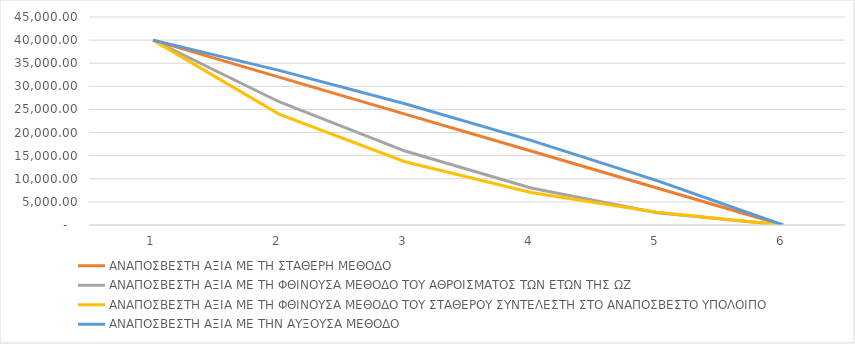
| Category |  ΑΝΑΠΟΣΒΕΣΤΗ ΑΞΙΑ ΜΕ ΤΗ ΣΤΑΘΕΡΗ ΜΕΘΟΔΟ  |  ΑΝΑΠΟΣΒΕΣΤΗ ΑΞΙΑ ΜΕ ΤΗ ΦΘΙΝΟΥΣΑ ΜΕΘΟΔΟ ΤΟΥ ΑΘΡΟΙΣΜΑΤΟΣ ΤΩΝ ΕΤΩΝ ΤΗΣ ΩΖ  |  ΑΝΑΠΟΣΒΕΣΤΗ ΑΞΙΑ ΜΕ ΤΗ ΦΘΙΝΟΥΣΑ ΜΕΘΟΔΟ ΤΟΥ ΣΤΑΘΕΡΟΥ ΣΥΝΤΕΛΕΣΤΗ ΣΤΟ ΑΝΑΠΟΣΒΕΣΤΟ ΥΠΟΛΟΙΠΟ  |  ΑΝΑΠΟΣΒΕΣΤΗ ΑΞΙΑ ΜΕ ΤΗΝ ΑΥΞΟΥΣΑ ΜΕΘΟΔΟ  |
|---|---|---|---|---|
| 0 | 40000 | 40000 | 40000 | 40000 |
| 1 | 32000 | 26666.667 | 23997.731 | 33448.101 |
| 2 | 24000 | 16000 | 13685.964 | 26241.012 |
| 3 | 16000 | 8000 | 7041.123 | 18313.214 |
| 4 | 8000 | 2666.667 | 2759.228 | 9592.636 |
| 5 | 0 | 0 | 0 | 0 |